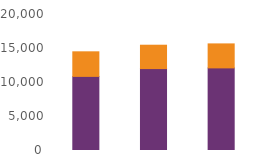
| Category | Online | Telephony |
|---|---|---|
| Apr23 | 10899 | 3613 |
| May23 | 12047 | 3436 |
| Jun23 | 12149 | 3528 |